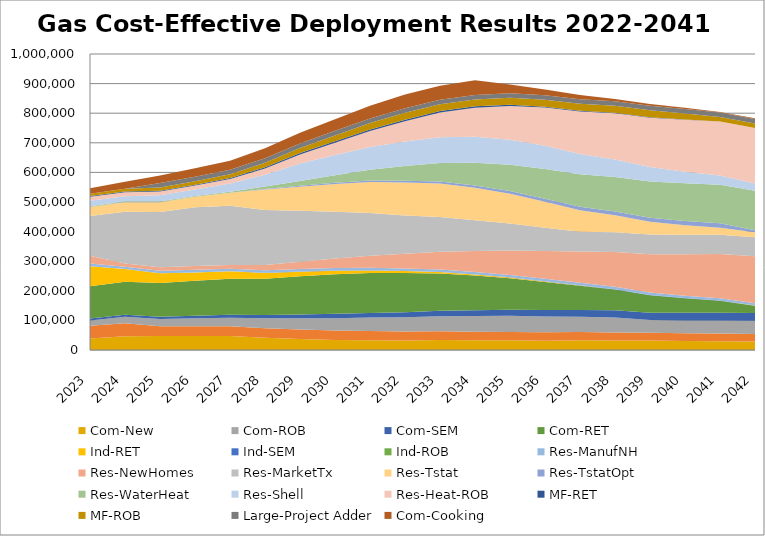
| Category | Com-New | NEEA-MartetTX | Com-ROB | Com-SEM | Com-RET | Ind-RET | Ind-SEM | Ind-ROB | Res-ManufNH | Res-NewHomes | Res-MarketTx | Res-Tstat | Res-TstatOpt | Res-WaterHeat | Res-Shell | Res-Heat-ROB | MF-RET | MF-ROB | Large-Project Adder | Com-Cooking |
|---|---|---|---|---|---|---|---|---|---|---|---|---|---|---|---|---|---|---|---|---|
| 2023.0 | 38548.04 | 43618 | 17540.068 | 6972.119 | 108679.705 | 67624.802 | 0 | 0 | 8970.167 | 26613.685 | 134313 | 30096.379 | 549.616 | 2533.864 | 17785.628 | 14146.66 | 1936.597 | 7746.388 | 0 | 18679.481 |
| 2024.0 | 46719.15 | 43618 | 21886.377 | 7141.809 | 110912.201 | 43179.5 | 0 | 0 | 8045.354 | 11107.839 | 174666.789 | 32219.21 | 464.626 | 2473.581 | 17350.134 | 13077.467 | 2416.473 | 9665.89 | 0 | 23285.503 |
| 2025.0 | 46955.071 | 32991.197 | 24466.8 | 7918.418 | 114097.372 | 32773.693 | 0 | 0 | 8516.834 | 11758.789 | 186463.202 | 33615.841 | 466.589 | 2484.034 | 19995.908 | 13132.727 | 2701.377 | 10805.507 | 15302.18 | 25151.12 |
| 2026.0 | 47192.184 | 32991.197 | 27000.801 | 8755.12 | 118220.002 | 28034.824 | 0 | 0 | 8970.167 | 12384.685 | 198302.815 | 35771.918 | 477.707 | 2543.225 | 21393.584 | 13445.665 | 2981.156 | 11924.622 | 15302.18 | 28019.098 |
| 2027.0 | 47430.494 | 32991.197 | 28950.585 | 9367.705 | 121659.783 | 25501.287 | 0 | 0 | 8970.167 | 12384.685 | 200106.154 | 43684.685 | 561.39 | 2988.736 | 27532.6 | 15801.013 | 3196.431 | 12785.724 | 15302.18 | 29957.533 |
| 2028.0 | 41466.506 | 32408.449 | 33587.728 | 11192.199 | 122187.132 | 19483.619 | 266.483 | 0 | 8814.919 | 17926.451 | 185520.585 | 68971.658 | 1829.077 | 8916.468 | 39905.531 | 20778.165 | 4410.168 | 15171.981 | 15302.18 | 33867.634 |
| 2029.0 | 37068.613 | 31835.994 | 38019.447 | 12654.172 | 129239.233 | 15842.914 | 324.119 | 0 | 8771.387 | 24442.666 | 171871.625 | 81661.468 | 3024.855 | 16400.426 | 58778.736 | 30243.306 | 4978.171 | 17475.692 | 15302.18 | 36066.763 |
| 2030.0 | 34185.83 | 31273.651 | 42062.712 | 14670.626 | 133482.109 | 12309.909 | 390.525 | 0 | 8615.193 | 31891.174 | 158129.723 | 93954.283 | 4132.704 | 25619.874 | 67996.143 | 41325.671 | 5400.86 | 19579.392 | 15302.18 | 39636.96 |
| 2031.0 | 33184.242 | 30721.24 | 45588.299 | 15807.063 | 134438.2 | 9202.248 | 463.978 | 0 | 8571.304 | 40300.425 | 144526.452 | 104423.205 | 5134.706 | 36607.009 | 76479.117 | 54030.585 | 5596.838 | 21396.601 | 15302.18 | 43558.306 |
| 2032.0 | 32261.635 | 30178.588 | 48536.903 | 16972.028 | 131899.443 | 6683.096 | 541.929 | 0 | 8415.084 | 49636.765 | 129604.825 | 111432.807 | 6010.996 | 49055.079 | 83235.166 | 68240.343 | 5510.949 | 22885.817 | 15302.18 | 46613.545 |
| 2033.0 | 33687.456 | 29645.521 | 50896.746 | 18153.8 | 126128.792 | 4752.215 | 618.907 | 0 | 8371.468 | 59933.597 | 116763.605 | 113526.926 | 6739.748 | 62498.99 | 87258.17 | 83123.466 | 5138.359 | 22845.561 | 15302.18 | 47167.396 |
| 2034.0 | 32708.444 | 29121.87 | 52738.542 | 19338.329 | 117396.504 | 3354.552 | 691.353 | 0 | 8271.905 | 70825.659 | 103877.427 | 109926.109 | 7864.782 | 76121.48 | 87789.546 | 98615.945 | 4532.937 | 22900.74 | 15302.18 | 49869.963 |
| 2035.0 | 32576.395 | 28607.468 | 54146.977 | 20509.282 | 106596.706 | 2368.982 | 750.948 | 0 | 8172.66 | 82123.981 | 91123.328 | 100909.26 | 8997.971 | 88982.085 | 84583.036 | 114174.659 | 3791.684 | 23451.844 | 15302.18 | 29796.87 |
| 2036.0 | 31573.64 | 28102.153 | 53871.228 | 21648.223 | 94614.592 | 1690.588 | 790.173 | 0 | 8073.77 | 94029.297 | 78955.945 | 87829.073 | 10132.736 | 100280.906 | 78040.967 | 129212.395 | 3022.16 | 23832.081 | 15302.18 | 19026.82 |
| 2037.0 | 33026.657 | 27605.763 | 51421.902 | 22734.932 | 82367.073 | 932.092 | 801.139 | 0 | 8031.486 | 105979.048 | 66956.051 | 72692 | 11261.497 | 109584.696 | 69124.295 | 143182.37 | 2311.077 | 24084.828 | 15302.18 | 14355.095 |
| 2038.0 | 32021.044 | 27118.142 | 51003.433 | 23747.903 | 70421.225 | 256.522 | 783.859 | 0 | 7933.378 | 118068.03 | 66654.006 | 57515.26 | 12375.668 | 116883.74 | 59059.955 | 155658.272 | 1708.677 | 23905.986 | 15302.18 | 7493.077 |
| 2039.0 | 31689.33 | 26639.133 | 42671.382 | 24664.992 | 59338.963 | 269.246 | 737.635 | 0 | 7891.905 | 129605.619 | 66279.429 | 43802.753 | 13465.675 | 122474.239 | 48990.857 | 166385.385 | 1230.556 | 23520.059 | 15302.18 | 5807.284 |
| 2040.0 | 30713.442 | 26168.586 | 43110.142 | 25464.231 | 49395.366 | 274.211 | 667.653 | 0 | 7794.622 | 140036.822 | 65692.407 | 32346.759 | 14521.017 | 126775.806 | 39476.101 | 175289.934 | 868.944 | 20222.043 | 15302.18 | 4056.583 |
| 2041.0 | 29678.347 | 25706.351 | 43994.034 | 26124.75 | 40720.232 | 269.882 | 580.985 | 0 | 7697.759 | 149582.61 | 65104.232 | 23323.309 | 15530.356 | 130190.73 | 30868.822 | 182450.842 | 432.377 | 15146.557 | 15302.18 | 1628.802 |
| 2042.0 | 28742.629 | 25252.28 | 44567.105 | 26627.775 | 24719.745 | 257.45 | 489.465 | 0 | 7657.543 | 158156.553 | 64515.252 | 16519.155 | 7308.208 | 133038.318 | 24402.41 | 188050.381 | 0 | 14872.074 | 15302.18 | 2777.802 |